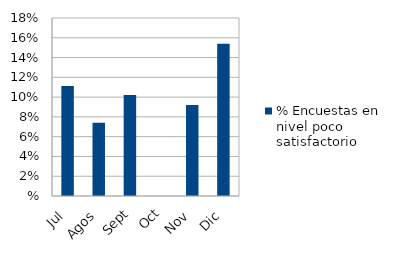
| Category | % Encuestas en nivel poco satisfactorio |
|---|---|
| Jul | 0.111 |
| Agos | 0.074 |
| Sept | 0.102 |
| Oct | 0 |
| Nov | 0.092 |
| Dic | 0.154 |